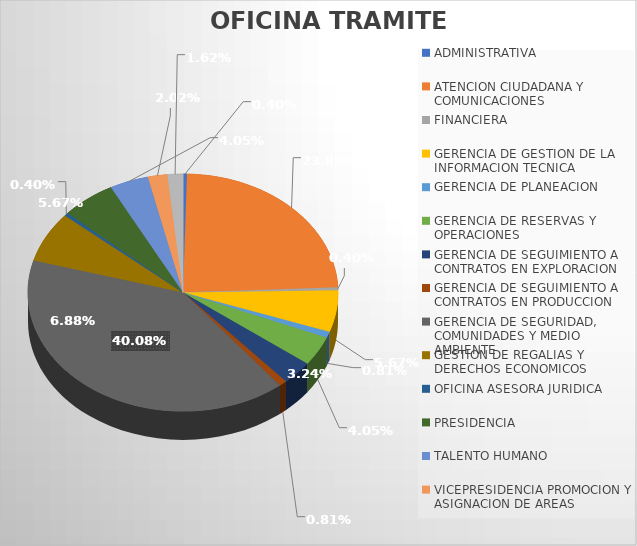
| Category | CANTIDAD |
|---|---|
| ADMINISTRATIVA | 1 |
| ATENCION CIUDADANA Y COMUNICACIONES | 59 |
| FINANCIERA | 1 |
| GERENCIA DE GESTION DE LA INFORMACION TECNICA | 14 |
| GERENCIA DE PLANEACION | 2 |
| GERENCIA DE RESERVAS Y OPERACIONES | 10 |
| GERENCIA DE SEGUIMIENTO A CONTRATOS EN EXPLORACION | 8 |
| GERENCIA DE SEGUIMIENTO A CONTRATOS EN PRODUCCION | 2 |
| GERENCIA DE SEGURIDAD, COMUNIDADES Y MEDIO AMBIENTE | 99 |
| GESTION DE REGALIAS Y DERECHOS ECONOMICOS | 17 |
| OFICINA ASESORA JURIDICA | 1 |
| PRESIDENCIA | 14 |
| TALENTO HUMANO | 10 |
| VICEPRESIDENCIA PROMOCION Y ASIGNACION DE AREAS | 5 |
| VICEPRESIDENCIA TECNICA | 4 |